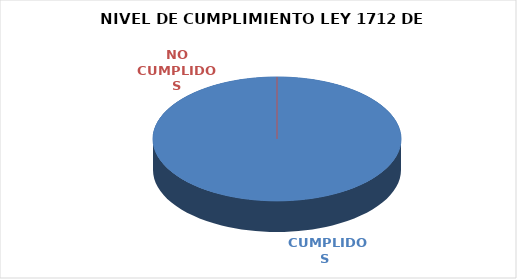
| Category | Series 0 |
|---|---|
|  CUMPLIDOS | 116 |
| NO CUMPLIDOS | 0 |